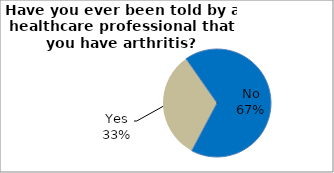
| Category | Series 0 |
|---|---|
| No | 67.475 |
| Yes | 32.525 |